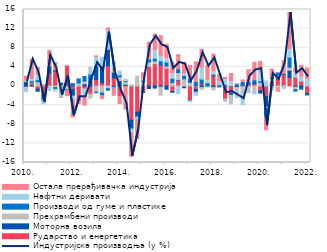
| Category | Рударство и енергетика | Моторна возила | Прехрамбени производи | Производи од гуме и пластике | Нафтни деривати | Остала прерађивачка индустрија |
|---|---|---|---|---|---|---|
| 2010.  | -0.25 | 0.917 | 0.255 | -0.052 | -0.879 | 0.861 |
| II  | 0.533 | -0.006 | 0.112 | 0.442 | 0.263 | 4.234 |
| III | -0.658 | -0.442 | 0.905 | 0.421 | 0.821 | 1.732 |
| IV | -1.977 | -0.557 | 0.067 | -0.479 | -0.692 | 0.217 |
| 2011.  | 2.629 | 1.148 | -0.147 | 0.26 | -0.854 | 3.398 |
| II | 3.096 | 0.115 | -0.324 | -0.379 | -0.372 | 1.665 |
| III | 0.396 | 0.213 | -0.786 | -0.054 | -1.543 | -0.157 |
| IV | 4.311 | -0.093 | -0.663 | -0.13 | 0.016 | -1.363 |
| 2012. | -0.795 | -1.326 | -0.05 | 0.507 | -0.692 | -3.847 |
| II | -2.992 | -0.038 | 0.619 | 0.964 | 0.007 | -0.81 |
| III | -0.594 | 0.455 | 0.596 | 0.935 | -1.603 | -2.027 |
| IV | -1.693 | 1.755 | -0.844 | 0.748 | 1.327 | 0.117 |
| 2013. | 1.379 | 2.888 | -1.307 | -0.096 | 1.688 | 0.348 |
| II | 0.67 | 3.522 | -1.489 | -0.51 | 1.83 | -0.806 |
| III | 4.231 | 3.434 | -0.568 | -0.304 | 3.797 | 0.673 |
| IV | 1.696 | 1.208 | 1.158 | -0.334 | 0.847 | -1.596 |
| 2014. | -2.161 | 1.13 | 0.807 | 0.393 | 0.802 | -1.723 |
| II | -0.11 | 0.347 | 0.545 | 0.211 | 0.344 | -4.95 |
| III | -7.18 | -1.514 | 0.263 | -0.321 | -0.737 | -5.186 |
| IV | -5.474 | -0.682 | 2.045 | -0.385 | -0.515 | -4.159 |
| 2015. | -1.166 | -0.124 | 0.988 | 0.199 | 0.193 | 1.4 |
| II | 4.108 | -0.512 | 0.939 | 0.612 | 0.045 | 3.428 |
| III | 4.672 | -0.433 | 0.58 | 0.533 | 1.685 | 3.367 |
| IV | 4.374 | -0.256 | -1.658 | 0.889 | 0.776 | 4.489 |
| 2016. | 3.704 | -0.676 | 0.466 | 0.847 | 0.604 | 3.087 |
| II | -1.157 | -0.153 | 0.726 | 0.855 | 0.971 | 2.402 |
| III | 1.195 | 0.118 | 1.515 | 0.608 | -1.596 | 3.097 |
| IV | -0.146 | -0.226 | 1.508 | 0.71 | 0.276 | 2.462 |
| 2017. | -3.027 | -0.05 | 0.748 | 0.731 | -0.158 | 2.839 |
| II | -0.719 | -0.58 | 0.035 | 0.706 | -0.624 | 4.3 |
| III | 0.456 | -0.334 | -0.348 | 0.978 | 2.27 | 3.953 |
| IV | -0.07 | 0.021 | -0.156 | 0.647 | 0.422 | 3.284 |
| 2018. | 2.099 | -0.328 | -0.488 | 0.366 | 0.453 | 3.762 |
| II | 0.302 | 0.019 | -0.018 | -0.182 | 0.477 | 1.645 |
| III | -2.651 | -0.029 | -0.529 | 0.253 | 1.076 | 0.486 |
| IV | -1.597 | -0.347 | -1.812 | 0.072 | 0.771 | 1.766 |
| 2019. | -0.079 | -0.235 | -0.646 | 0.265 | -1.418 | 0.224 |
| II | 0.197 | -0.13 | -1.544 | 0.553 | -2.246 | 0.509 |
| III | 0.401 | -0.045 | -1.239 | 0.42 | -0.078 | 2.588 |
| IV | 0.463 | 0.224 | -1.281 | 0.441 | -0.334 | 3.839 |
| 2020. | -1.019 | -0.467 | 0.75 | 0.317 | 1.951 | 2.101 |
| II | -2.182 | -2.255 | -0.246 | -1.832 | 1.059 | -2.852 |
| III | 1.043 | -0.11 | 0.514 | 0.101 | -0.806 | 1.889 |
| IV | 1.474 | 0.245 | 0.531 | 0.493 | -0.344 | -0.959 |
| 2021. | 2.44 | 0.018 | -0.05 | 0.011 | -0.499 | 2.847 |
| II | 1.812 | 1.497 | 0.622 | 2.097 | 1.568 | 7.778 |
| III | 1.87 | -0.247 | -0.495 | -0.327 | 0.952 | 0.919 |
| IV | 1.066 | -0.406 | 0.014 | -0.279 | 0.727 | 2.524 |
| 2022. | -1.584 | -0.211 | 0.287 | -0.082 | 1.109 | 2.381 |